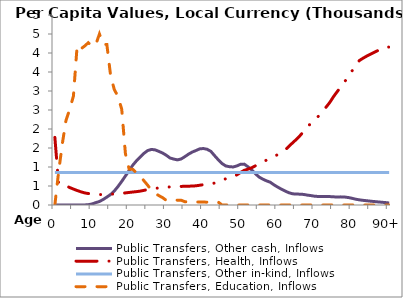
| Category | Public Transfers, Other cash, Inflows | Public Transfers, Health, Inflows | Public Transfers, Other in-kind, Inflows | Public Transfers, Education, Inflows |
|---|---|---|---|---|
| 0 | 0 | 1780.607 | 855.829 | 0 |
|  | 0 | 568.802 | 855.829 | 860.049 |
| 2 | 0 | 547.456 | 855.829 | 1605.313 |
| 3 | 0 | 504.079 | 855.829 | 2226.036 |
| 4 | 0 | 458.881 | 855.829 | 2516.784 |
| 5 | 0 | 419.225 | 855.829 | 2867.094 |
| 6 | 0 | 380.75 | 855.829 | 4194.694 |
| 7 | 0.185 | 347.665 | 855.829 | 4109.16 |
| 8 | 1.44 | 318.881 | 855.829 | 4181.727 |
| 9 | 7.832 | 301.876 | 855.829 | 4270.62 |
| 10 | 27.309 | 290.949 | 855.829 | 4182.723 |
| 11 | 61.793 | 281.45 | 855.829 | 4210.338 |
| 12 | 92.023 | 275.107 | 855.829 | 4499.482 |
| 13 | 144.724 | 273.875 | 855.829 | 4229.837 |
| 14 | 208.018 | 278.285 | 855.829 | 4223.244 |
| 15 | 275.751 | 284.444 | 855.829 | 3411.633 |
| 16 | 367.549 | 290.741 | 855.829 | 3038.19 |
| 17 | 487.256 | 298.163 | 855.829 | 2856.9 |
| 18 | 620.787 | 307.366 | 855.829 | 2520.95 |
| 19 | 764.354 | 318.522 | 855.829 | 1348.424 |
| 20 | 906.952 | 330.28 | 855.829 | 945.273 |
| 21 | 1050.361 | 341.586 | 855.829 | 937.717 |
| 22 | 1166.38 | 352.152 | 855.829 | 840.821 |
| 23 | 1262.373 | 365.686 | 855.829 | 760.677 |
| 24 | 1360.816 | 385.381 | 855.829 | 636.145 |
| 25 | 1432.463 | 407.684 | 855.829 | 519.088 |
| 26 | 1462.409 | 428.514 | 855.829 | 389.29 |
| 27 | 1450.43 | 440.316 | 855.829 | 308.409 |
| 28 | 1411.061 | 447.154 | 855.829 | 246.65 |
| 29 | 1367.976 | 457.08 | 855.829 | 193.942 |
| 30 | 1309.094 | 467.488 | 855.829 | 121.941 |
| 31 | 1237.426 | 476.846 | 855.829 | 120.589 |
| 32 | 1208.82 | 483.1 | 855.829 | 121.648 |
| 33 | 1187.454 | 486.275 | 855.829 | 127.977 |
| 34 | 1211.304 | 489.193 | 855.829 | 125.889 |
| 35 | 1271.805 | 492.412 | 855.829 | 86.439 |
| 36 | 1338.819 | 495.532 | 855.829 | 82.691 |
| 37 | 1393.154 | 498.109 | 855.829 | 79.209 |
| 38 | 1434.336 | 505.621 | 855.829 | 78.544 |
| 39 | 1477.024 | 519.647 | 855.829 | 79.481 |
| 40 | 1486.479 | 535.478 | 855.829 | 76.318 |
| 41 | 1465.856 | 549.917 | 855.829 | 75.084 |
| 42 | 1412.427 | 558.72 | 855.829 | 74.629 |
| 43 | 1298.619 | 577.652 | 855.829 | 76.108 |
| 44 | 1190.189 | 613.42 | 855.829 | 76.15 |
| 45 | 1091.77 | 653.192 | 855.829 | 0 |
| 46 | 1028.395 | 690.118 | 855.829 | 0 |
| 47 | 1008.615 | 708.609 | 855.829 | 0 |
| 48 | 1000.867 | 736.15 | 855.829 | 0 |
| 49 | 1027.92 | 793.761 | 855.829 | 0 |
| 50 | 1071.628 | 856.993 | 855.829 | 0 |
| 51 | 1075.587 | 912.726 | 855.829 | 0 |
| 52 | 1004.514 | 944.588 | 855.829 | 0 |
| 53 | 921.269 | 979.902 | 855.829 | 0 |
| 54 | 821.743 | 1032.386 | 855.829 | 0 |
| 55 | 735.425 | 1081.545 | 855.829 | 0 |
| 56 | 679.189 | 1129.865 | 855.829 | 0 |
| 57 | 634.978 | 1182.784 | 855.829 | 0 |
| 58 | 598.78 | 1237.847 | 855.829 | 0 |
| 59 | 530.114 | 1282.681 | 855.829 | 0 |
| 60 | 471.154 | 1323.983 | 855.829 | 0 |
| 61 | 416.401 | 1373.647 | 855.829 | 0 |
| 62 | 366.907 | 1448.641 | 855.829 | 0 |
| 63 | 323.356 | 1542.486 | 855.829 | 0 |
| 64 | 295.134 | 1635.587 | 855.829 | 0 |
| 65 | 286.719 | 1724.578 | 855.829 | 0 |
| 66 | 285.838 | 1824.104 | 855.829 | 0 |
| 67 | 277.704 | 1940.974 | 855.829 | 0 |
| 68 | 259.767 | 2057.086 | 855.829 | 0 |
| 69 | 246.974 | 2155.103 | 855.829 | 0 |
| 70 | 230.813 | 2239.035 | 855.829 | 0 |
| 71 | 223.733 | 2340.686 | 855.829 | 0 |
| 72 | 222.537 | 2458.503 | 855.829 | 0 |
| 73 | 225.398 | 2573.507 | 855.829 | 0 |
| 74 | 221.722 | 2696.095 | 855.829 | 0 |
| 75 | 214.694 | 2847.792 | 855.829 | 0 |
| 76 | 211.154 | 2981.874 | 855.829 | 0 |
| 77 | 213.912 | 3104.523 | 855.829 | 0 |
| 78 | 209.714 | 3239.693 | 855.829 | 0 |
| 79 | 196.721 | 3382.991 | 855.829 | 0 |
| 80 | 176.773 | 3527.477 | 855.829 | 0 |
| 81 | 152.737 | 3667.843 | 855.829 | 0 |
| 82 | 135.086 | 3803.655 | 855.829 | 0 |
| 83 | 122.578 | 3864.856 | 855.829 | 0 |
| 84 | 111.593 | 3919.851 | 855.829 | 0 |
| 85 | 100.669 | 3969.207 | 855.829 | 0 |
| 86 | 90.672 | 4017.336 | 855.829 | 0 |
| 87 | 81.393 | 4066.136 | 855.829 | 0 |
| 88 | 72.632 | 4113.209 | 855.829 | 0 |
| 89 | 63.98 | 4156.169 | 855.829 | 0 |
| 90+ | 53.117 | 4155.964 | 855.829 | 0 |